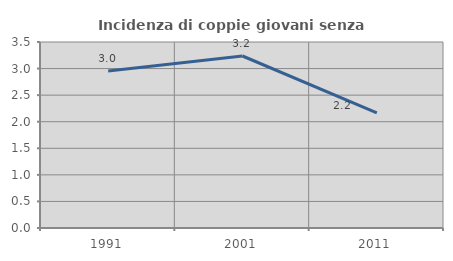
| Category | Incidenza di coppie giovani senza figli |
|---|---|
| 1991.0 | 2.955 |
| 2001.0 | 3.237 |
| 2011.0 | 2.167 |